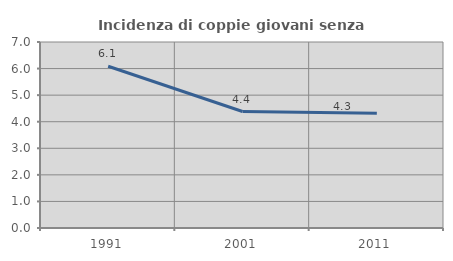
| Category | Incidenza di coppie giovani senza figli |
|---|---|
| 1991.0 | 6.087 |
| 2001.0 | 4.383 |
| 2011.0 | 4.317 |